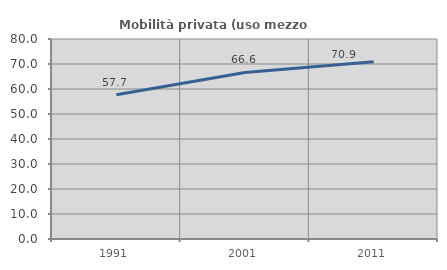
| Category | Mobilità privata (uso mezzo privato) |
|---|---|
| 1991.0 | 57.669 |
| 2001.0 | 66.601 |
| 2011.0 | 70.946 |